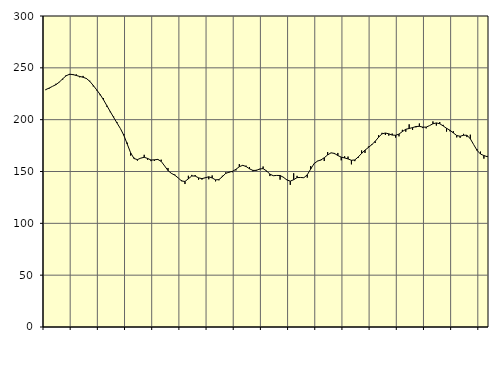
| Category | Piggar | Series 1 |
|---|---|---|
| nan | 228.5 | 228.99 |
| 87.0 | 229.9 | 230.46 |
| 87.0 | 232.1 | 232.12 |
| 87.0 | 234.6 | 233.77 |
| nan | 236.5 | 236.21 |
| 88.0 | 238.6 | 239.39 |
| 88.0 | 243 | 242.3 |
| 88.0 | 243.2 | 243.8 |
| nan | 243 | 243.53 |
| 89.0 | 243.7 | 242.62 |
| 89.0 | 240.9 | 241.7 |
| 89.0 | 242.2 | 240.94 |
| nan | 240.1 | 239.66 |
| 90.0 | 237.5 | 236.91 |
| 90.0 | 232.1 | 232.99 |
| 90.0 | 228.3 | 228.8 |
| nan | 223.6 | 224.38 |
| 91.0 | 220.8 | 219.25 |
| 91.0 | 212.5 | 213.54 |
| 91.0 | 207.2 | 207.82 |
| nan | 203 | 202.2 |
| 92.0 | 197.5 | 196.71 |
| 92.0 | 191.4 | 191.39 |
| 92.0 | 186.1 | 184.88 |
| nan | 177.8 | 176.49 |
| 93.0 | 165.4 | 168.1 |
| 93.0 | 163.3 | 162.52 |
| 93.0 | 160.5 | 161.46 |
| nan | 163 | 162.91 |
| 94.0 | 166.1 | 163.72 |
| 94.0 | 161.3 | 162.6 |
| 94.0 | 160 | 161.07 |
| nan | 160.2 | 161.27 |
| 95.0 | 161.1 | 161.66 |
| 95.0 | 161.4 | 159.78 |
| 95.0 | 155.3 | 155.4 |
| nan | 153.4 | 150.91 |
| 96.0 | 148 | 148.22 |
| 96.0 | 147.1 | 146.48 |
| 96.0 | 143.9 | 143.83 |
| nan | 141.6 | 140.88 |
| 97.0 | 137.9 | 140.37 |
| 97.0 | 145.9 | 142.99 |
| 97.0 | 146.7 | 145.66 |
| nan | 146.6 | 145.6 |
| 98.0 | 142.1 | 143.88 |
| 98.0 | 142.2 | 143.14 |
| 98.0 | 144.3 | 143.97 |
| nan | 142.5 | 144.91 |
| 99.0 | 146.2 | 143.79 |
| 99.0 | 140.5 | 141.96 |
| 99.0 | 141.5 | 142.19 |
| nan | 145.9 | 144.98 |
| 0.0 | 149.2 | 148.2 |
| 0.0 | 149 | 149.38 |
| 0.0 | 149.3 | 150.17 |
| nan | 151 | 152.11 |
| 1.0 | 157.1 | 154.62 |
| 1.0 | 155.6 | 155.96 |
| 1.0 | 155.6 | 154.81 |
| nan | 154.3 | 152.6 |
| 2.0 | 150.2 | 151.04 |
| 2.0 | 151.6 | 151.04 |
| 2.0 | 152 | 152.45 |
| nan | 154.8 | 152.76 |
| 3.0 | 150 | 150.59 |
| 3.0 | 145.6 | 147.49 |
| 3.0 | 145.8 | 145.92 |
| nan | 146.2 | 146.2 |
| 4.0 | 142.1 | 146.15 |
| 4.0 | 144.7 | 144.38 |
| 4.0 | 142.2 | 141.85 |
| nan | 137.1 | 140.7 |
| 5.0 | 148.3 | 142.08 |
| 5.0 | 145.8 | 144.14 |
| 5.0 | 144.3 | 144.23 |
| nan | 144 | 144.01 |
| 6.0 | 144.1 | 146.81 |
| 6.0 | 155.2 | 152.31 |
| 6.0 | 157.4 | 157.58 |
| nan | 160.2 | 160.02 |
| 7.0 | 160.8 | 161.16 |
| 7.0 | 160.1 | 163.24 |
| 7.0 | 168.8 | 166.01 |
| nan | 167.9 | 168 |
| 8.0 | 166.8 | 167.46 |
| 8.0 | 167.9 | 165.4 |
| 8.0 | 160.8 | 163.87 |
| nan | 164.7 | 163.08 |
| 9.0 | 164.4 | 162.14 |
| 9.0 | 156.9 | 160.8 |
| 9.0 | 160 | 161.14 |
| nan | 163.2 | 163.99 |
| 10.0 | 170.3 | 167.44 |
| 10.0 | 167.9 | 170.6 |
| 10.0 | 174.1 | 173.19 |
| nan | 176.5 | 175.88 |
| 11.0 | 177.5 | 179.09 |
| 11.0 | 185 | 183.1 |
| 11.0 | 187.3 | 186.33 |
| nan | 185.2 | 187.13 |
| 12.0 | 184.6 | 186.35 |
| 12.0 | 186.6 | 185.14 |
| 12.0 | 182.7 | 184.95 |
| nan | 183.9 | 186.07 |
| 13.0 | 190.2 | 188.53 |
| 13.0 | 188.4 | 190.73 |
| 13.0 | 195.5 | 191.49 |
| nan | 190.1 | 192.33 |
| 14.0 | 192.6 | 193.39 |
| 14.0 | 196.3 | 193.58 |
| 14.0 | 191.9 | 192.82 |
| nan | 191.6 | 192.8 |
| 15.0 | 194.3 | 194.28 |
| 15.0 | 198.3 | 196.05 |
| 15.0 | 194.3 | 196.85 |
| nan | 197.7 | 196.08 |
| 16.0 | 195 | 193.96 |
| 16.0 | 188.5 | 191.69 |
| 16.0 | 188.8 | 189.8 |
| nan | 188.9 | 187.23 |
| 17.0 | 182.9 | 184.71 |
| 17.0 | 182.5 | 183.98 |
| 17.0 | 186.3 | 184.97 |
| nan | 183.2 | 184.98 |
| 18.0 | 185.5 | 181.55 |
| 18.0 | 175.9 | 175.88 |
| 18.0 | 171.4 | 170.3 |
| nan | 169.2 | 166.85 |
| 19.0 | 162.4 | 165.39 |
| 19.0 | 165 | 164.25 |